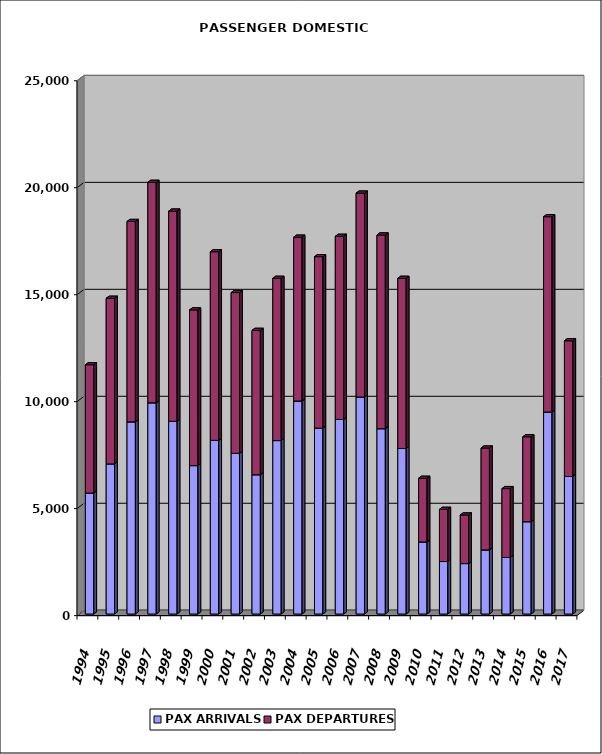
| Category | PAX ARRIVALS | PAX DEPARTURES |
|---|---|---|
| 1994.0 | 5655 | 5995 |
| 1995.0 | 7017 | 7741 |
| 1996.0 | 8982 | 9365 |
| 1997.0 | 9872 | 10305 |
| 1998.0 | 9007 | 9825 |
| 1999.0 | 6937 | 7276 |
| 2000.0 | 8116 | 8817 |
| 2001.0 | 7510 | 7515 |
| 2002.0 | 6510 | 6747 |
| 2003.0 | 8107 | 7583 |
| 2004.0 | 9957 | 7656 |
| 2005.0 | 8688 | 8013 |
| 2006.0 | 9093 | 8561 |
| 2007.0 | 10145 | 9528 |
| 2008.0 | 8662 | 9053 |
| 2009.0 | 7737 | 7953 |
| 2010.0 | 3367 | 2976 |
| 2011.0 | 2453 | 2438 |
| 2012.0 | 2358 | 2271 |
| 2013.0 | 2995 | 4763 |
| 2014.0 | 2643 | 3218 |
| 2015.0 | 4315 | 3969 |
| 2016.0 | 9440 | 9130 |
| 2017.0 | 6427 | 6344 |